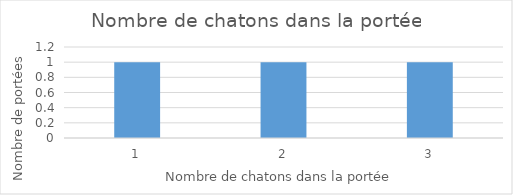
| Category | Series 0 |
|---|---|
| 1.0 | 1 |
| 2.0 | 1 |
| 3.0 | 1 |